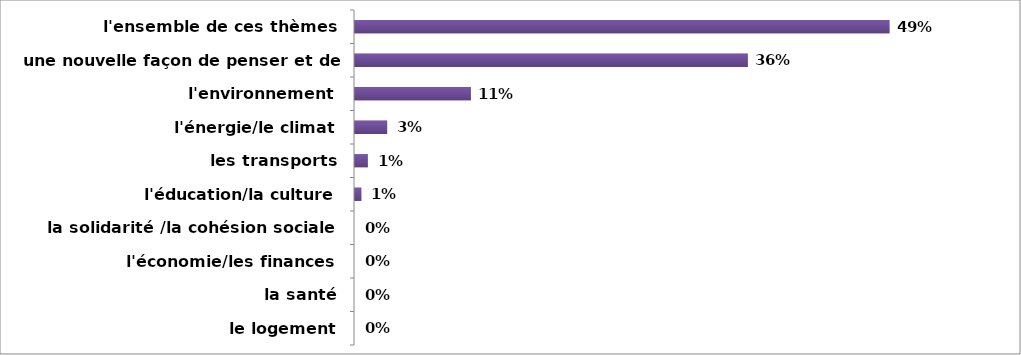
| Category | Series 0 |
|---|---|
| le logement | 0 |
| la santé | 0 |
| l'économie/les finances | 0 |
| la solidarité /la cohésion sociale | 0 |
| l'éducation/la culture | 0.006 |
| les transports | 0.012 |
| l'énergie/le climat | 0.029 |
| l'environnement | 0.106 |
| une nouvelle façon de penser et de faire | 0.359 |
| l'ensemble de ces thèmes | 0.488 |